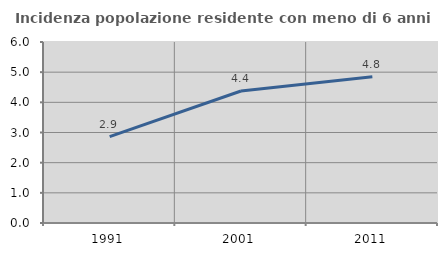
| Category | Incidenza popolazione residente con meno di 6 anni |
|---|---|
| 1991.0 | 2.861 |
| 2001.0 | 4.376 |
| 2011.0 | 4.845 |